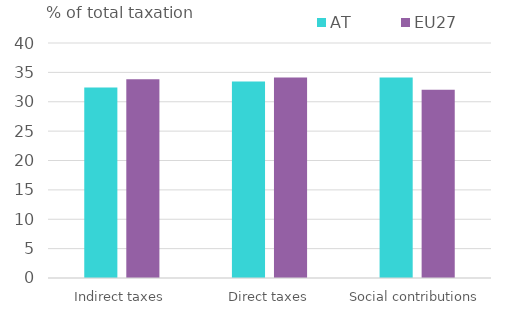
| Category | AT | EU27 |
|---|---|---|
| Indirect taxes | 32.421 | 33.811 |
| Direct taxes | 33.456 | 34.133 |
| Social contributions | 34.123 | 32.056 |